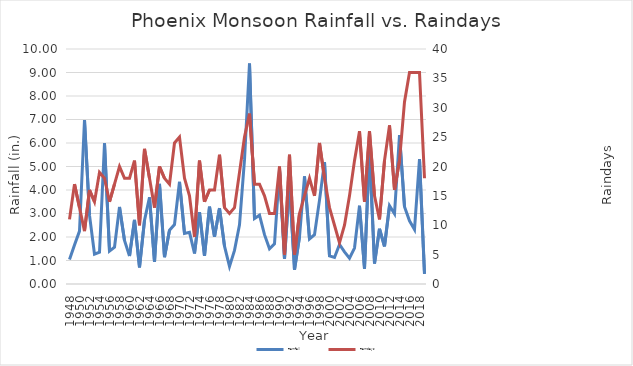
| Category | Rainfall |
|---|---|
| 1948.0 | 1.04 |
| 1949.0 | 1.66 |
| 1950.0 | 2.25 |
| 1951.0 | 6.98 |
| 1952.0 | 2.93 |
| 1953.0 | 1.27 |
| 1954.0 | 1.35 |
| 1955.0 | 5.99 |
| 1956.0 | 1.4 |
| 1957.0 | 1.57 |
| 1958.0 | 3.28 |
| 1959.0 | 1.85 |
| 1960.0 | 1.19 |
| 1961.0 | 2.73 |
| 1962.0 | 0.71 |
| 1963.0 | 2.71 |
| 1964.0 | 3.69 |
| 1965.0 | 0.94 |
| 1966.0 | 4.26 |
| 1967.0 | 1.14 |
| 1968.0 | 2.29 |
| 1969.0 | 2.53 |
| 1970.0 | 4.35 |
| 1971.0 | 2.15 |
| 1972.0 | 2.2 |
| 1973.0 | 1.3 |
| 1974.0 | 3.06 |
| 1975.0 | 1.2 |
| 1976.0 | 3.29 |
| 1977.0 | 2.01 |
| 1978.0 | 3.23 |
| 1979.0 | 1.61 |
| 1980.0 | 0.75 |
| 1981.0 | 1.43 |
| 1982.0 | 2.52 |
| 1983.0 | 5.29 |
| 1984.0 | 9.38 |
| 1985.0 | 2.79 |
| 1986.0 | 2.93 |
| 1987.0 | 2.1 |
| 1988.0 | 1.5 |
| 1989.0 | 1.71 |
| 1990.0 | 4.86 |
| 1991.0 | 1.07 |
| 1992.0 | 4.28 |
| 1993.0 | 0.61 |
| 1994.0 | 2.01 |
| 1995.0 | 4.58 |
| 1996.0 | 1.92 |
| 1997.0 | 2.1 |
| 1998.0 | 3.57 |
| 1999.0 | 5.19 |
| 2000.0 | 1.2 |
| 2001.0 | 1.13 |
| 2002.0 | 1.68 |
| 2003.0 | 1.37 |
| 2004.0 | 1.1 |
| 2005.0 | 1.53 |
| 2006.0 | 3.33 |
| 2007.0 | 0.65 |
| 2008.0 | 5.7 |
| 2009.0 | 0.87 |
| 2010.0 | 2.35 |
| 2011.0 | 1.6 |
| 2012.0 | 3.33 |
| 2013.0 | 2.99 |
| 2014.0 | 6.34 |
| 2015.0 | 3.29 |
| 2016.0 | 2.69 |
| 2017.0 | 2.32 |
| 2018.0 | 5.31 |